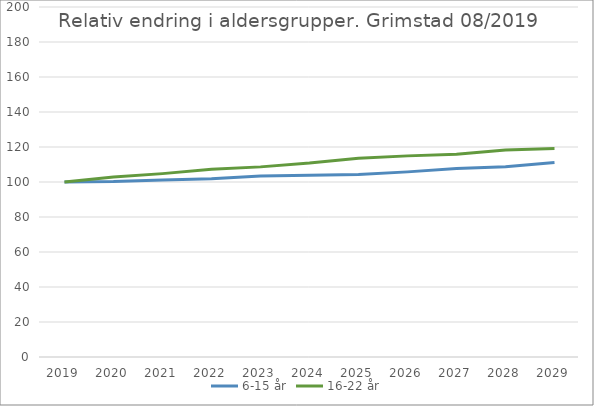
| Category | 6-15 år | 16-22 år |
|---|---|---|
| 2019 | 100 | 100 |
| 2020 | 100.255 | 102.79 |
| 2021 | 101.197 | 104.786 |
| 2022 | 101.84 | 107.239 |
| 2023 | 103.416 | 108.642 |
| 2024 | 103.825 | 110.799 |
| 2025 | 104.317 | 113.611 |
| 2026 | 105.785 | 114.929 |
| 2027 | 107.695 | 115.839 |
| 2028 | 108.729 | 118.346 |
| 2029 | 111.202 | 119.074 |